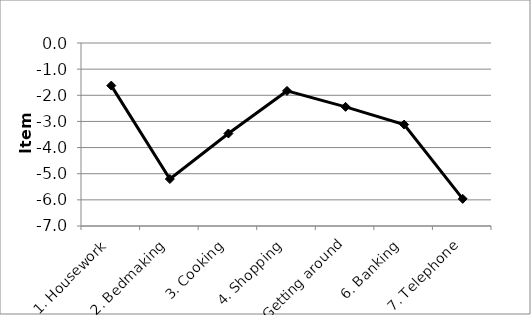
| Category | Series 0 |
|---|---|
| 1. Housework | -1.629 |
| 2. Bedmaking | -5.202 |
| 3. Cooking | -3.462 |
| 4. Shopping | -1.833 |
| 5. Getting around | -2.442 |
| 6. Banking | -3.12 |
| 7. Telephone | -5.962 |